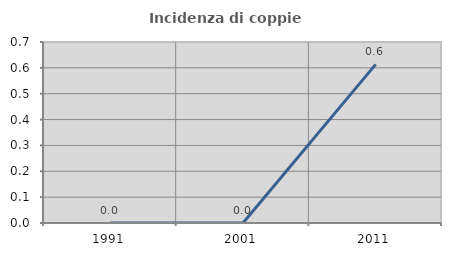
| Category | Incidenza di coppie miste |
|---|---|
| 1991.0 | 0 |
| 2001.0 | 0 |
| 2011.0 | 0.613 |